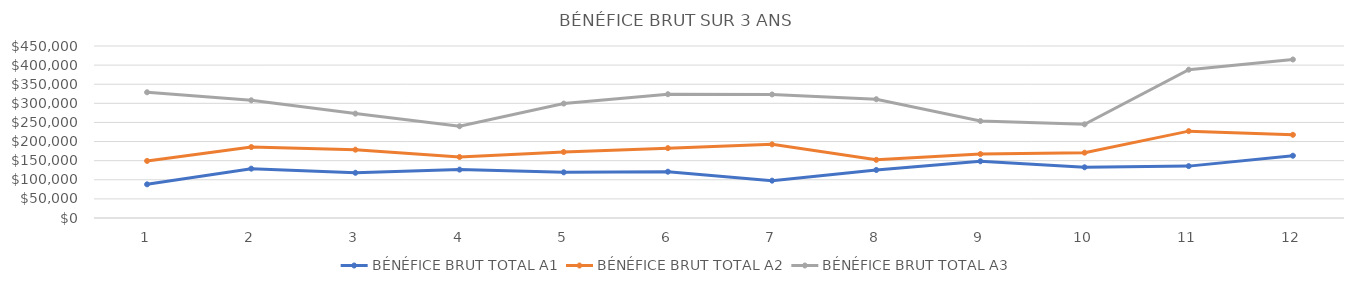
| Category | BÉNÉFICE BRUT TOTAL A1 | BÉNÉFICE BRUT TOTAL A2 | BÉNÉFICE BRUT TOTAL A3 |
|---|---|---|---|
| 0 | 88114 | 149299.8 | 328920.1 |
| 1 | 129087 | 185572.05 | 307938.2 |
| 2 | 118320 | 178734.75 | 273173.6 |
| 3 | 126600 | 159643.5 | 240058.1 |
| 4 | 119528 | 172671.8 | 299376.2 |
| 5 | 121091.5 | 182784.4 | 323907 |
| 6 | 97705.5 | 192648.75 | 323256.1 |
| 7 | 125637 | 152163.2 | 310748.5 |
| 8 | 148434 | 167284.6 | 253671.3 |
| 9 | 132710 | 170910.05 | 245075.1 |
| 10 | 135723 | 227271.75 | 388017.1 |
| 11 | 162928 | 217656 | 414703.8 |